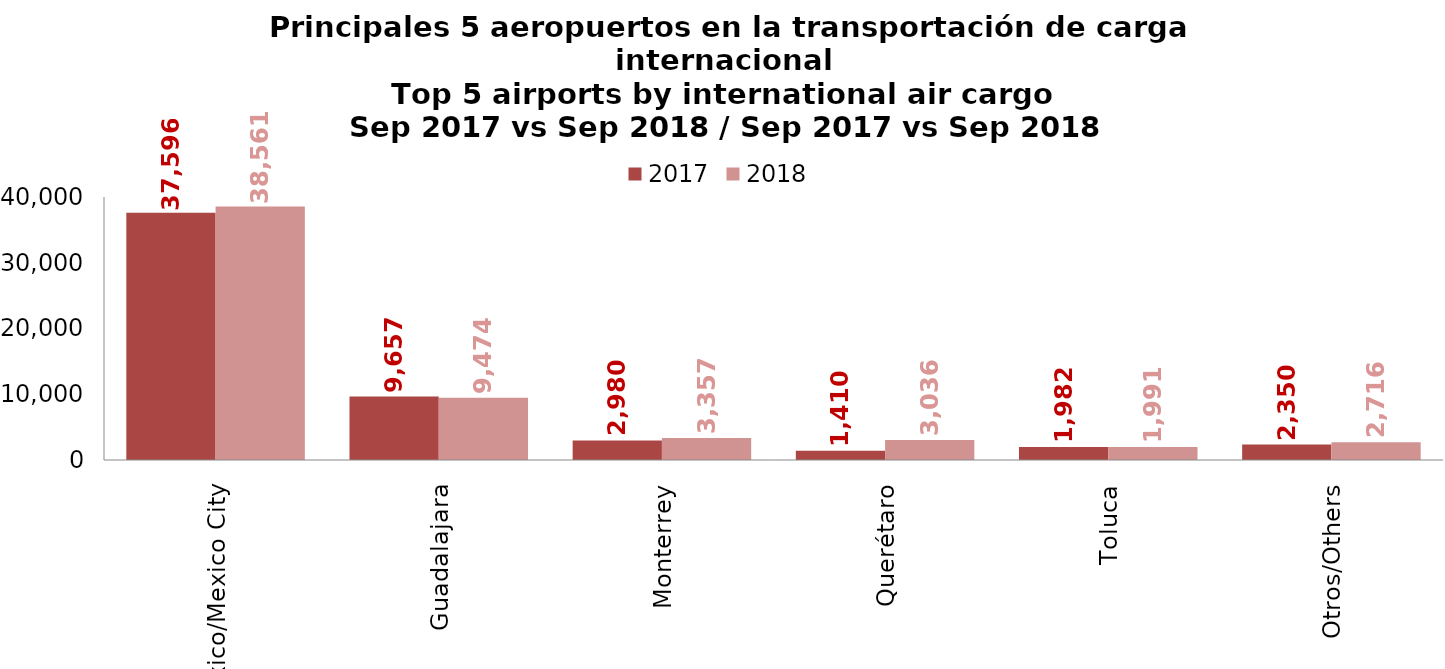
| Category | 2017 | 2018 |
|---|---|---|
| Ciudad De México/Mexico City | 37596.01 | 38560.64 |
| Guadalajara | 9656.978 | 9473.968 |
| Monterrey | 2979.591 | 3357.243 |
| Querétaro | 1410.197 | 3035.808 |
| Toluca | 1981.743 | 1990.581 |
| Otros/Others | 2350.498 | 2716.383 |